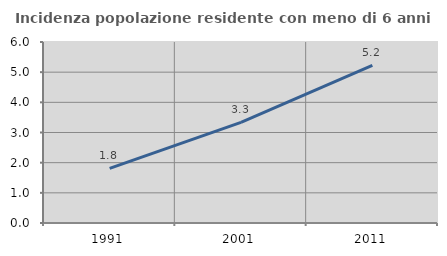
| Category | Incidenza popolazione residente con meno di 6 anni |
|---|---|
| 1991.0 | 1.81 |
| 2001.0 | 3.333 |
| 2011.0 | 5.226 |